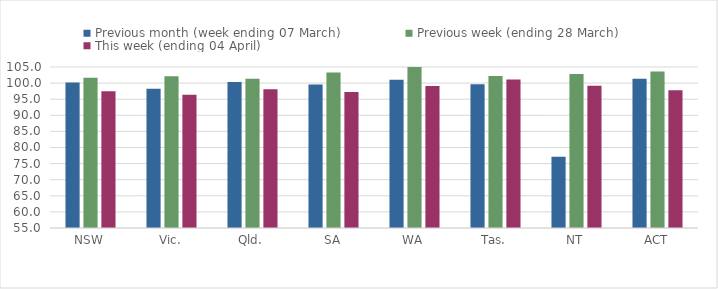
| Category | Previous month (week ending 07 March) | Previous week (ending 28 March) | This week (ending 04 April) |
|---|---|---|---|
| NSW | 100.203 | 101.7 | 97.464 |
| Vic. | 98.284 | 102.091 | 96.384 |
| Qld. | 100.307 | 101.364 | 98.084 |
| SA | 99.561 | 103.299 | 97.21 |
| WA | 101.064 | 105.269 | 99.097 |
| Tas. | 99.634 | 102.2 | 101.123 |
| NT | 77.147 | 102.82 | 99.165 |
| ACT | 101.363 | 103.632 | 97.793 |